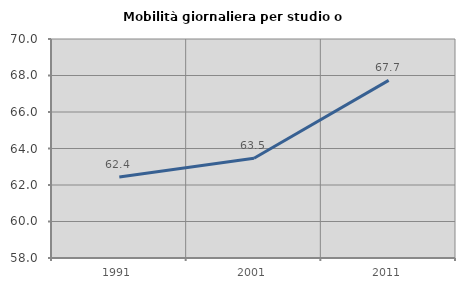
| Category | Mobilità giornaliera per studio o lavoro |
|---|---|
| 1991.0 | 62.436 |
| 2001.0 | 63.466 |
| 2011.0 | 67.731 |